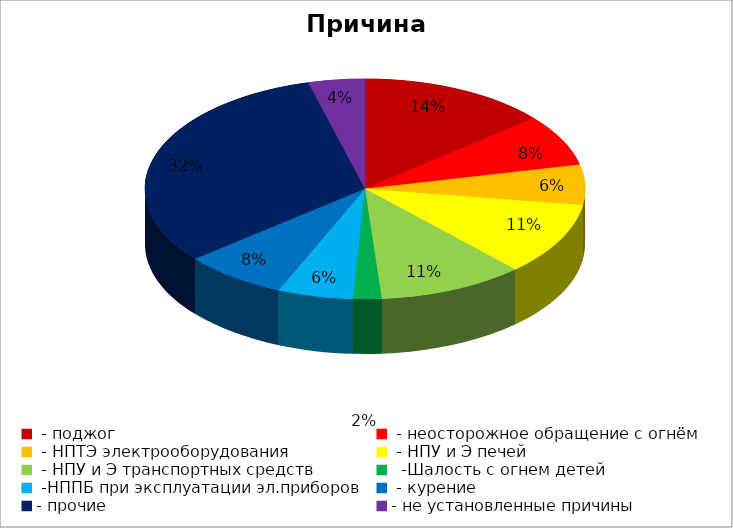
| Category | Причина пожара |
|---|---|
|  - поджог | 40 |
|  - неосторожное обращение с огнём | 22 |
|  - НПТЭ электрооборудования | 17 |
|  - НПУ и Э печей | 31 |
|  - НПУ и Э транспортных средств | 31 |
|   -Шалость с огнем детей | 6 |
|  -НППБ при эксплуатации эл.приборов | 16 |
|  - курение | 22 |
| - прочие | 92 |
| - не установленные причины | 12 |